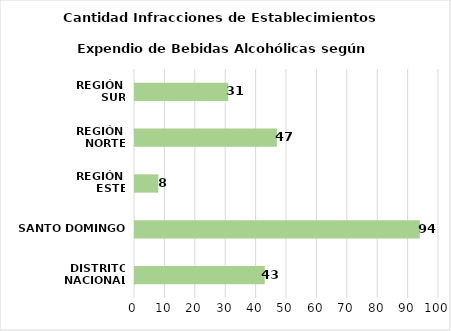
| Category | Series 0 |
|---|---|
| DISTRITO NACIONAL | 43 |
| SANTO DOMINGO | 94 |
| REGIÓN 
ESTE | 8 |
| REGIÓN 
NORTE | 47 |
| REGIÓN 
SUR | 31 |